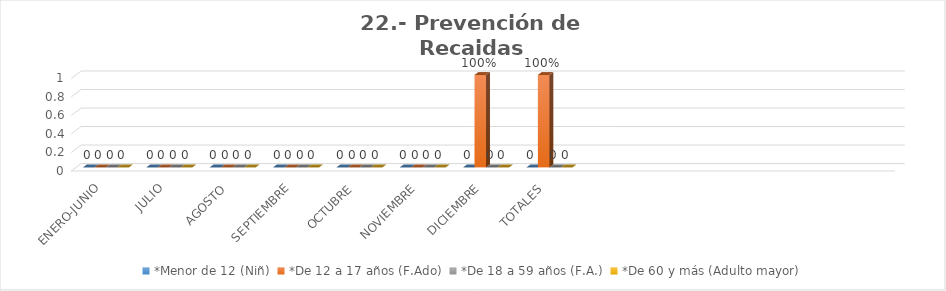
| Category | *Menor de 12 (Niñ) | *De 12 a 17 años (F.Ado) | *De 18 a 59 años (F.A.) | *De 60 y más (Adulto mayor) |
|---|---|---|---|---|
| ENERO-JUNIO | 0 | 0 | 0 | 0 |
| JULIO | 0 | 0 | 0 | 0 |
| AGOSTO | 0 | 0 | 0 | 0 |
| SEPTIEMBRE | 0 | 0 | 0 | 0 |
| OCTUBRE | 0 | 0 | 0 | 0 |
| NOVIEMBRE | 0 | 0 | 0 | 0 |
| DICIEMBRE | 0 | 1 | 0 | 0 |
| TOTALES | 0 | 1 | 0 | 0 |